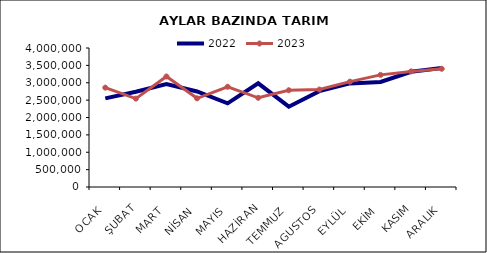
| Category | 2022 | 2023 |
|---|---|---|
| OCAK | 2549557.38 | 2859016.861 |
| ŞUBAT | 2742201.21 | 2543645.469 |
| MART | 2963191.96 | 3180809.053 |
| NİSAN | 2748370.538 | 2551910.142 |
| MAYIS | 2407876.961 | 2885326.13 |
| HAZİRAN | 2983668.015 | 2566801.568 |
| TEMMUZ | 2311169.927 | 2784743.176 |
| AGUSTOS | 2758878.642 | 2804342.764 |
| EYLÜL | 2981816.997 | 3031468.51 |
| EKİM | 3023908.701 | 3226989.963 |
| KASIM | 3316958.187 | 3327026.671 |
| ARALIK | 3425181.181 | 3402172.824 |